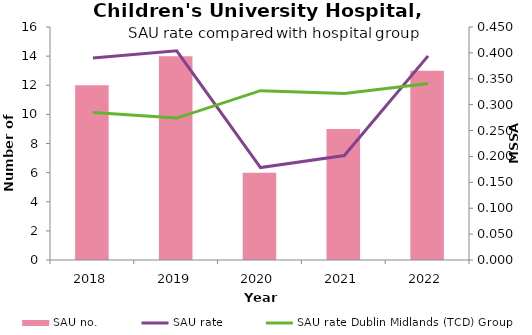
| Category | SAU no. |
|---|---|
| 2018.0 | 12 |
| 2019.0 | 14 |
| 2020.0 | 6 |
| 2021.0 | 9 |
| 2022.0 | 13 |